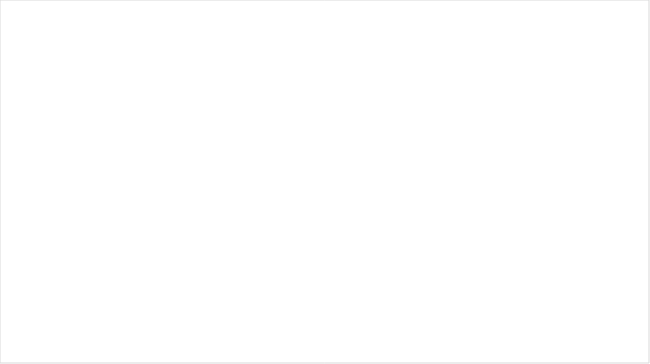
| Category | Aangevraagde toevoegingen | Afgegeven toevoegingen | Vastgestelde toevoegingen |
|---|---|---|---|
| 2010 | 476975 | 413052 | 385756 |
| 2011 | 463058 | 398691 | 381715 |
| 2012 | 486267 | 430954 | 401801 |
| 2013 | 478666 | 433048 | 381435 |
| 2014 | 460116 | 420860 | 386236 |
| 2015 | 440792 | 409957 | 377879 |
| 2016 | 447622 | 419442 | 379727 |
| 2017 | 416394 | 389794 | 355230 |
| 2018 | 406130 | 381597 | 348103 |
| 2019 | 402521 | 376660 | 346487 |
| 2020 | 377706 | 352325 | 301304 |
| 2021 | 350084 | 328039 | 308269 |
| 2022 | 371240 | 348021 | 298100 |